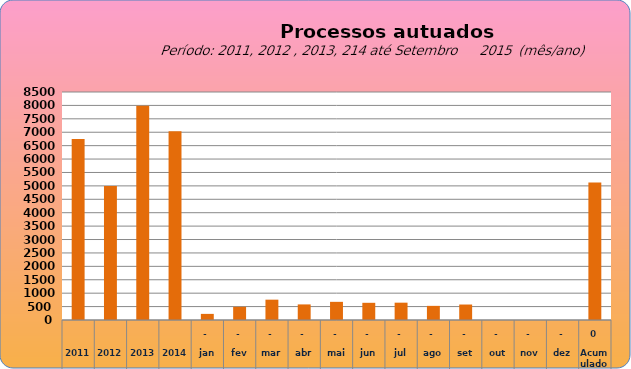
| Category | 6749 4997 7990 7034  228   486   758   581   676   641   646   527   577   -     -     -     5.120  |
|---|---|
| 2011 | 6749 |
| 2012 | 4997 |
| 2013 | 7990 |
| 2014 | 7034 |
| jan | 228 |
| fev | 492 |
| mar | 758 |
| abr | 581 |
| mai | 677 |
| jun | 641 |
| jul | 646 |
| ago | 527 |
| set | 577 |
| out | 0 |
| nov | 0 |
| dez | 0 |
| Acumulado
 | 5127 |